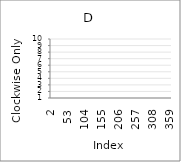
| Category | Series 0 |
|---|---|
| 2.0 | 1 |
| 3.0 | 6 |
| 4.0 | 3 |
| 5.0 | 6 |
| 6.0 | 5 |
| 7.0 | 10 |
| 8.0 | 7 |
| 9.0 | 8 |
| 10.0 | 5 |
| 11.0 | 2 |
| 12.0 | 7 |
| 13.0 | 9 |
| 14.0 | 8 |
| 15.0 | 6 |
| 16.0 | 3 |
| 17.0 | 9 |
| 18.0 | 4 |
| 19.0 | 3 |
| 20.0 | 4 |
| 21.0 | 2 |
| 22.0 | 3 |
| 23.0 | 8 |
| 24.0 | 5 |
| 25.0 | 5 |
| 26.0 | 7 |
| 27.0 | 5 |
| 28.0 | 9 |
| 29.0 | 4 |
| 30.0 | 8 |
| 31.0 | 8 |
| 32.0 | 9 |
| 33.0 | 9 |
| 34.0 | 7 |
| 35.0 | 1 |
| 36.0 | 4 |
| 37.0 | 3 |
| 38.0 | 3 |
| 39.0 | 9 |
| 40.0 | 6 |
| 41.0 | 5 |
| 42.0 | 9 |
| 43.0 | 1 |
| 44.0 | 9 |
| 45.0 | 4 |
| 46.0 | 8 |
| 47.0 | 7 |
| 48.0 | 1 |
| 49.0 | 5 |
| 50.0 | 9 |
| 51.0 | 3 |
| 52.0 | 1 |
| 53.0 | 8 |
| 54.0 | 4 |
| 55.0 | 10 |
| 56.0 | 4 |
| 57.0 | 6 |
| 58.0 | 6 |
| 59.0 | 3 |
| 60.0 | 10 |
| 61.0 | 5 |
| 62.0 | 5 |
| 63.0 | 7 |
| 64.0 | 10 |
| 65.0 | 6 |
| 66.0 | 1 |
| 67.0 | 6 |
| 68.0 | 2 |
| 69.0 | 5 |
| 70.0 | 6 |
| 71.0 | 8 |
| 72.0 | 9 |
| 73.0 | 4 |
| 74.0 | 2 |
| 75.0 | 7 |
| 76.0 | 6 |
| 77.0 | 9 |
| 78.0 | 2 |
| 79.0 | 9 |
| 80.0 | 6 |
| 81.0 | 6 |
| 82.0 | 2 |
| 83.0 | 7 |
| 84.0 | 2 |
| 85.0 | 1 |
| 86.0 | 7 |
| 87.0 | 9 |
| 88.0 | 8 |
| 89.0 | 1 |
| 90.0 | 9 |
| 91.0 | 6 |
| 92.0 | 1 |
| 93.0 | 10 |
| 94.0 | 5 |
| 95.0 | 7 |
| 96.0 | 1 |
| 97.0 | 2 |
| 98.0 | 8 |
| 99.0 | 3 |
| 100.0 | 4 |
| 101.0 | 2 |
| 102.0 | 6 |
| 103.0 | 6 |
| 104.0 | 1 |
| 105.0 | 7 |
| 106.0 | 6 |
| 107.0 | 3 |
| 108.0 | 3 |
| 109.0 | 4 |
| 110.0 | 1 |
| 111.0 | 9 |
| 112.0 | 7 |
| 113.0 | 8 |
| 114.0 | 6 |
| 115.0 | 5 |
| 116.0 | 2 |
| 117.0 | 5 |
| 118.0 | 4 |
| 119.0 | 7 |
| 120.0 | 9 |
| 121.0 | 4 |
| 122.0 | 2 |
| 123.0 | 1 |
| 124.0 | 6 |
| 125.0 | 2 |
| 126.0 | 6 |
| 127.0 | 6 |
| 128.0 | 10 |
| 129.0 | 10 |
| 130.0 | 6 |
| 131.0 | 2 |
| 132.0 | 4 |
| 133.0 | 4 |
| 134.0 | 10 |
| 135.0 | 4 |
| 136.0 | 10 |
| 137.0 | 5 |
| 138.0 | 7 |
| 139.0 | 8 |
| 140.0 | 4 |
| 141.0 | 6 |
| 142.0 | 1 |
| 143.0 | 2 |
| 144.0 | 3 |
| 145.0 | 9 |
| 146.0 | 1 |
| 147.0 | 4 |
| 148.0 | 2 |
| 149.0 | 10 |
| 150.0 | 9 |
| 151.0 | 8 |
| 152.0 | 9 |
| 153.0 | 1 |
| 154.0 | 7 |
| 155.0 | 4 |
| 156.0 | 6 |
| 157.0 | 6 |
| 158.0 | 7 |
| 159.0 | 6 |
| 160.0 | 4 |
| 161.0 | 5 |
| 162.0 | 2 |
| 163.0 | 2 |
| 164.0 | 5 |
| 165.0 | 10 |
| 166.0 | 6 |
| 167.0 | 4 |
| 168.0 | 9 |
| 169.0 | 9 |
| 170.0 | 10 |
| 171.0 | 7 |
| 172.0 | 7 |
| 173.0 | 3 |
| 174.0 | 1 |
| 175.0 | 1 |
| 176.0 | 7 |
| 177.0 | 10 |
| 178.0 | 4 |
| 179.0 | 10 |
| 180.0 | 3 |
| 181.0 | 5 |
| 182.0 | 5 |
| 183.0 | 8 |
| 184.0 | 2 |
| 185.0 | 1 |
| 186.0 | 6 |
| 187.0 | 3 |
| 188.0 | 5 |
| 189.0 | 2 |
| 190.0 | 2 |
| 191.0 | 2 |
| 192.0 | 7 |
| 193.0 | 9 |
| 194.0 | 1 |
| 195.0 | 5 |
| 196.0 | 8 |
| 197.0 | 3 |
| 198.0 | 3 |
| 199.0 | 3 |
| 200.0 | 1 |
| 201.0 | 4 |
| 202.0 | 6 |
| 203.0 | 6 |
| 204.0 | 1 |
| 205.0 | 5 |
| 206.0 | 2 |
| 207.0 | 6 |
| 208.0 | 7 |
| 209.0 | 8 |
| 210.0 | 7 |
| 211.0 | 6 |
| 212.0 | 6 |
| 213.0 | 1 |
| 214.0 | 6 |
| 215.0 | 7 |
| 216.0 | 10 |
| 217.0 | 8 |
| 218.0 | 9 |
| 219.0 | 5 |
| 220.0 | 2 |
| 221.0 | 1 |
| 222.0 | 3 |
| 223.0 | 1 |
| 224.0 | 10 |
| 225.0 | 9 |
| 226.0 | 2 |
| 227.0 | 4 |
| 228.0 | 1 |
| 229.0 | 1 |
| 230.0 | 10 |
| 231.0 | 3 |
| 232.0 | 5 |
| 233.0 | 10 |
| 234.0 | 3 |
| 235.0 | 7 |
| 236.0 | 9 |
| 237.0 | 9 |
| 238.0 | 1 |
| 239.0 | 1 |
| 240.0 | 6 |
| 241.0 | 10 |
| 242.0 | 3 |
| 243.0 | 8 |
| 244.0 | 9 |
| 245.0 | 1 |
| 246.0 | 6 |
| 247.0 | 6 |
| 248.0 | 3 |
| 249.0 | 4 |
| 250.0 | 3 |
| 251.0 | 9 |
| 252.0 | 1 |
| 253.0 | 7 |
| 254.0 | 8 |
| 255.0 | 10 |
| 256.0 | 5 |
| 257.0 | 10 |
| 258.0 | 6 |
| 259.0 | 9 |
| 260.0 | 6 |
| 261.0 | 8 |
| 262.0 | 4 |
| 263.0 | 8 |
| 264.0 | 2 |
| 265.0 | 4 |
| 266.0 | 9 |
| 267.0 | 7 |
| 268.0 | 5 |
| 269.0 | 1 |
| 270.0 | 10 |
| 271.0 | 6 |
| 272.0 | 9 |
| 273.0 | 3 |
| 274.0 | 10 |
| 275.0 | 1 |
| 276.0 | 10 |
| 277.0 | 7 |
| 278.0 | 1 |
| 279.0 | 4 |
| 280.0 | 2 |
| 281.0 | 8 |
| 282.0 | 7 |
| 283.0 | 4 |
| 284.0 | 4 |
| 285.0 | 5 |
| 286.0 | 1 |
| 287.0 | 1 |
| 288.0 | 4 |
| 289.0 | 6 |
| 290.0 | 6 |
| 291.0 | 8 |
| 292.0 | 3 |
| 293.0 | 10 |
| 294.0 | 7 |
| 295.0 | 6 |
| 296.0 | 10 |
| 297.0 | 1 |
| 298.0 | 10 |
| 299.0 | 5 |
| 300.0 | 2 |
| 301.0 | 6 |
| 302.0 | 8 |
| 303.0 | 3 |
| 304.0 | 2 |
| 305.0 | 4 |
| 306.0 | 3 |
| 307.0 | 10 |
| 308.0 | 6 |
| 309.0 | 1 |
| 310.0 | 5 |
| 311.0 | 2 |
| 312.0 | 10 |
| 313.0 | 5 |
| 314.0 | 3 |
| 315.0 | 7 |
| 316.0 | 8 |
| 317.0 | 2 |
| 318.0 | 3 |
| 319.0 | 9 |
| 320.0 | 1 |
| 321.0 | 5 |
| 322.0 | 8 |
| 323.0 | 6 |
| 324.0 | 5 |
| 325.0 | 2 |
| 326.0 | 10 |
| 327.0 | 2 |
| 328.0 | 5 |
| 329.0 | 4 |
| 330.0 | 4 |
| 331.0 | 10 |
| 332.0 | 7 |
| 333.0 | 4 |
| 334.0 | 2 |
| 335.0 | 6 |
| 336.0 | 5 |
| 337.0 | 10 |
| 338.0 | 8 |
| 339.0 | 10 |
| 340.0 | 6 |
| 341.0 | 5 |
| 342.0 | 8 |
| 343.0 | 7 |
| 344.0 | 2 |
| 345.0 | 10 |
| 346.0 | 10 |
| 347.0 | 4 |
| 348.0 | 5 |
| 349.0 | 2 |
| 350.0 | 3 |
| 351.0 | 8 |
| 352.0 | 5 |
| 353.0 | 10 |
| 354.0 | 4 |
| 355.0 | 7 |
| 356.0 | 9 |
| 357.0 | 3 |
| 358.0 | 9 |
| 359.0 | 8 |
| 360.0 | 4 |
| 361.0 | 9 |
| 362.0 | 7 |
| 363.0 | 2 |
| 364.0 | 9 |
| 365.0 | 9 |